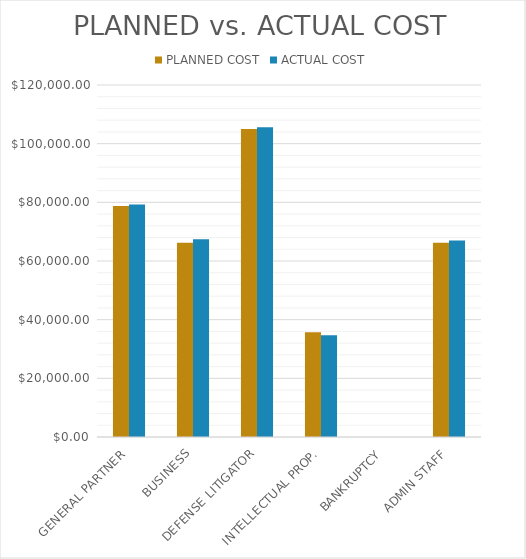
| Category | PLANNED COST | ACTUAL COST |
|---|---|---|
| GENERAL PARTNER | 78750 | 79275 |
| BUSINESS | 66250 | 67375 |
| DEFENSE LITIGATOR | 105000 | 105600 |
| INTELLECTUAL PROP. | 35750 | 34650 |
| BANKRUPTCY | 0 | 0 |
| ADMIN STAFF | 66250 | 67000 |